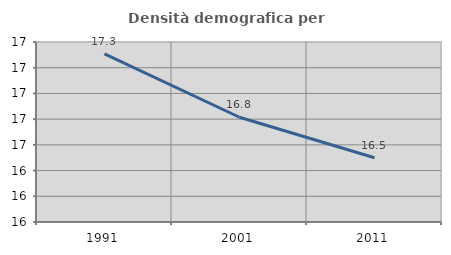
| Category | Densità demografica |
|---|---|
| 1991.0 | 17.307 |
| 2001.0 | 16.815 |
| 2011.0 | 16.5 |